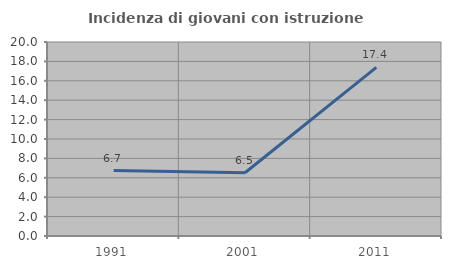
| Category | Incidenza di giovani con istruzione universitaria |
|---|---|
| 1991.0 | 6.742 |
| 2001.0 | 6.522 |
| 2011.0 | 17.391 |